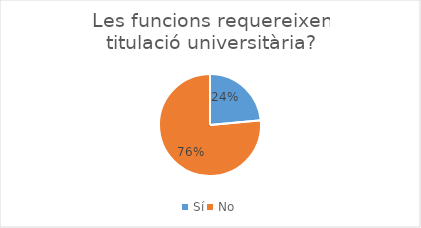
| Category | Series 0 |
|---|---|
| Sí | 4 |
| No | 13 |